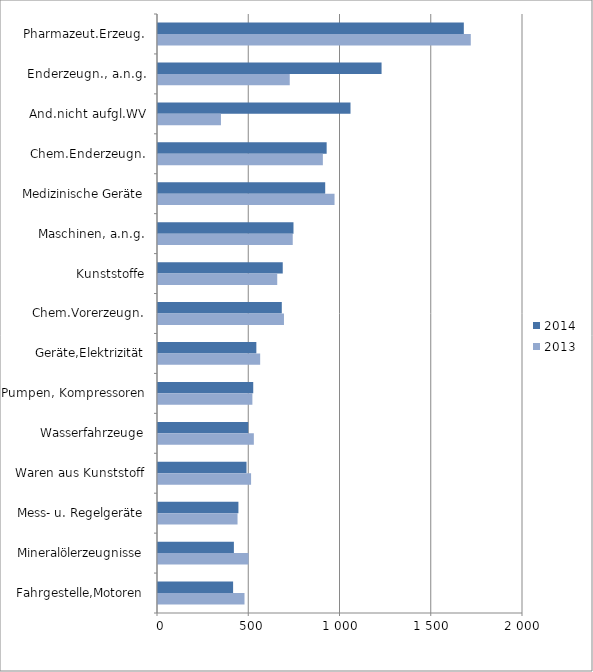
| Category | 2014 | 2013 |
|---|---|---|
| Pharmazeut.Erzeug. | 1675.737 | 1713.89 |
| Enderzeugn., a.n.g. | 1225.005 | 721.951 |
| And.nicht aufgl.WV | 1054.787 | 344.97 |
| Chem.Enderzeugn. | 924.165 | 903.373 |
| Medizinische Geräte | 916.192 | 967.325 |
| Maschinen, a.n.g. | 742.377 | 738.302 |
| Kunststoffe | 683.537 | 653.279 |
| Chem.Vorerzeugn. | 678.31 | 690.248 |
| Geräte,Elektrizität | 538.904 | 559.786 |
| Pumpen, Kompressoren | 521.824 | 517.185 |
| Wasserfahrzeuge | 494.384 | 525.182 |
| Waren aus Kunststoff | 484.974 | 510.029 |
| Mess- u. Regelgeräte | 440.651 | 435.814 |
| Mineralölerzeugnisse | 415.818 | 496.27 |
| Fahrgestelle,Motoren | 411.526 | 473.947 |